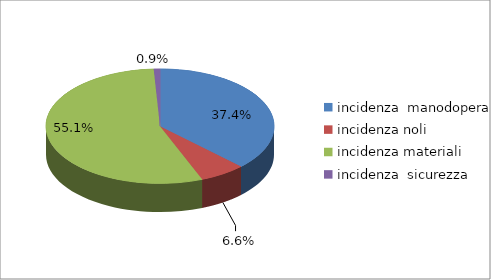
| Category | Series 0 |
|---|---|
| incidenza  manodopera  | 0.374 |
| incidenza noli  | 0.066 |
| incidenza materiali | 0.551 |
| incidenza  sicurezza | 0.009 |